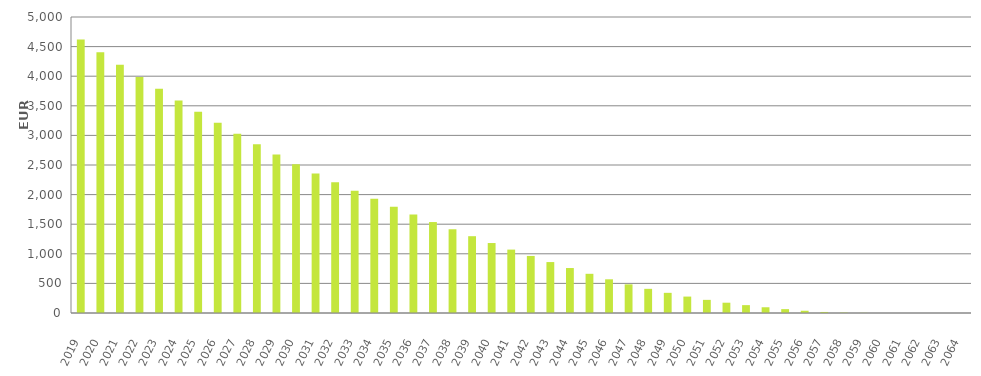
| Category | EUR Millions |
|---|---|
| 2019.0 | 4620000000.01 |
| 2020.0 | 4406349288.839 |
| 2021.0 | 4195206751.956 |
| 2022.0 | 3988402382.31 |
| 2023.0 | 3786936271.363 |
| 2024.0 | 3590499441.33 |
| 2025.0 | 3398816616.02 |
| 2026.0 | 3211726791.722 |
| 2027.0 | 3028790480.62 |
| 2028.0 | 2850599219.482 |
| 2029.0 | 2678479546.761 |
| 2030.0 | 2514201079.554 |
| 2031.0 | 2357009659.632 |
| 2032.0 | 2206764719.882 |
| 2033.0 | 2065641985.255 |
| 2034.0 | 1929568535.961 |
| 2035.0 | 1794443394.622 |
| 2036.0 | 1663086876.465 |
| 2037.0 | 1536319190.301 |
| 2038.0 | 1414445833.64 |
| 2039.0 | 1297347567.634 |
| 2040.0 | 1181857023.248 |
| 2041.0 | 1070901919.793 |
| 2042.0 | 963804528.65 |
| 2043.0 | 860245237.544 |
| 2044.0 | 759647985.173 |
| 2045.0 | 662059447.491 |
| 2046.0 | 569129919.153 |
| 2047.0 | 483752359.207 |
| 2048.0 | 408207515.124 |
| 2049.0 | 340571955.511 |
| 2050.0 | 277343048.195 |
| 2051.0 | 221720224.51 |
| 2052.0 | 173930691.82 |
| 2053.0 | 132943123.79 |
| 2054.0 | 96938103.683 |
| 2055.0 | 65265188.144 |
| 2056.0 | 38118043.076 |
| 2057.0 | 17443330.448 |
| 2058.0 | 6566695.542 |
| 2059.0 | 2511083.467 |
| 2060.0 | 451703.947 |
| 2061.0 | 111035.628 |
| 2062.0 | 34682.809 |
| 2063.0 | 4891.187 |
| 2064.0 | 0 |